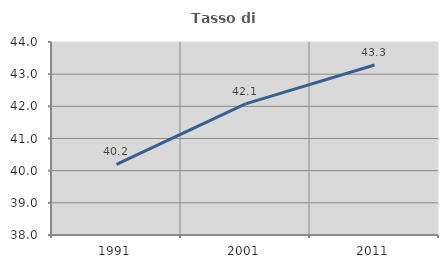
| Category | Tasso di occupazione   |
|---|---|
| 1991.0 | 40.194 |
| 2001.0 | 42.075 |
| 2011.0 | 43.284 |